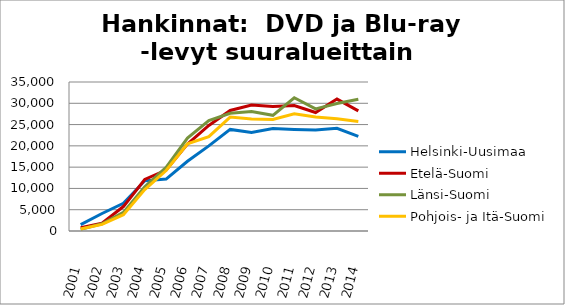
| Category | Helsinki-Uusimaa | Etelä-Suomi | Länsi-Suomi | Pohjois- ja Itä-Suomi |
|---|---|---|---|---|
| 2001.0 | 1516 | 748 | 420 | 460 |
| 2002.0 | 4112 | 1853 | 1705 | 1560 |
| 2003.0 | 6519 | 5741 | 4369 | 3825 |
| 2004.0 | 11785 | 12102 | 10366 | 9726 |
| 2005.0 | 12207 | 14297 | 14951 | 14208 |
| 2006.0 | 16378 | 20402 | 21824 | 20503 |
| 2007.0 | 19985 | 24803 | 25950 | 22181 |
| 2008.0 | 23863 | 28307 | 27642 | 26757 |
| 2009.0 | 23142 | 29576 | 28050 | 26299 |
| 2010.0 | 24076 | 29217 | 27181 | 26204 |
| 2011.0 | 23843 | 29480 | 31308 | 27554 |
| 2012.0 | 23717 | 27826 | 28673 | 26793 |
| 2013.0 | 24111 | 30987 | 29958 | 26375 |
| 2014.0 | 22238 | 28232 | 30942 | 25727 |